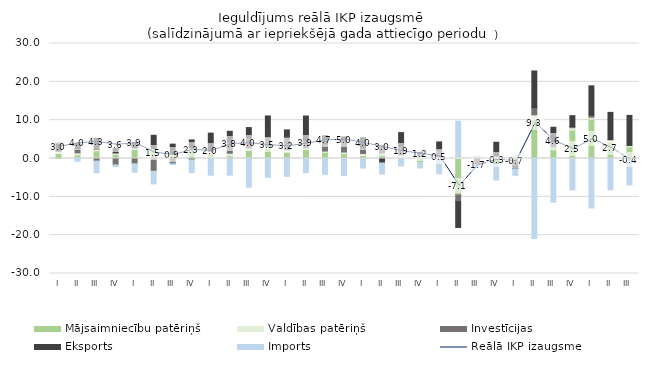
| Category | Mājsaimniecību patēriņš | Valdības patēriņš | Investīcijas | Eksports | Imports |
|---|---|---|---|---|---|
| I | 1.369 | 0.594 | 0.023 | 2.079 | 0.012 |
| II | 0.934 | 0.546 | 1.115 | 1.38 | -0.743 |
| III | 2.006 | 0.497 | -0.669 | 2.704 | -3.081 |
| IV | 1.069 | 0.364 | -1.672 | 1.163 | -0.421 |
| I | 2.418 | 0.322 | -1.384 | 1.455 | -2.215 |
| II | 2.213 | 0.311 | -3.328 | 3.532 | -3.31 |
| III | 0.946 | 0.376 | -1.386 | 2.427 | -0.192 |
| IV | 2.215 | 0.534 | -0.372 | 2.1 | -3.323 |
| I | 1.254 | 0.593 | 0.29 | 4.476 | -4.351 |
| II | 0.702 | 0.678 | 2.958 | 2.759 | -4.357 |
| III | 2.07 | 0.653 | 2.687 | 2.659 | -7.496 |
| IV | 2.59 | 0.538 | 2.384 | 5.592 | -4.909 |
| I | 1.824 | 0.428 | 3.536 | 1.675 | -4.673 |
| II | 2.402 | 0.333 | 1.917 | 6.428 | -3.675 |
| III | 1.61 | 0.333 | 1.946 | 2.061 | -4.127 |
| IV | 1.249 | 0.428 | 3.022 | 0.923 | -4.415 |
| I | 0.732 | 0.582 | 1.476 | 2.638 | -2.495 |
| II | 0.754 | 0.659 | 2.018 | -1.163 | -2.891 |
| III | 0.27 | 0.631 | 2.217 | 3.636 | -1.938 |
| IV | -1.105 | 0.587 | 0.739 | 0.246 | -1.352 |
| I | 0.019 | 0.471 | 1.713 | 2.124 | -4.017 |
| II | -9.509 | 0.418 | -1.728 | -6.753 | 9.303 |
| III | -0.003 | 0.564 | -1.529 | -0.139 | -0.571 |
| IV | -1.066 | 0.626 | -0.458 | 3.614 | -4.081 |
| I | -0.727 | 0.774 | -1.328 | -0.621 | -1.7 |
| II | 10.222 | 0.925 | 2.128 | 9.56 | -20.861 |
| III | 2.246 | 0.751 | 1.336 | 3.819 | -11.349 |
| IV | 7.411 | 0.621 | 0.297 | 2.848 | -8.225 |
| I | 10.307 | 0.457 | 0.537 | 7.655 | -12.916 |
| II | 4.339 | 0.366 | 0.13 | 7.2 | -8.154 |
| III | 3.053 | 0.344 | -0.005 | 7.852 | -6.909 |